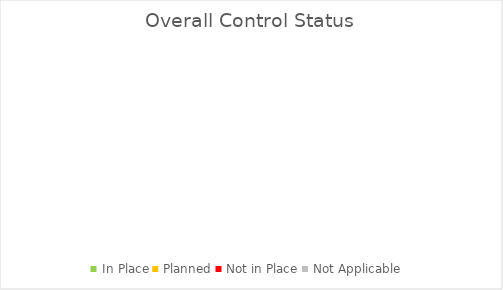
| Category | Series 0 |
|---|---|
| In Place | 0 |
| Planned | 0 |
| Not in Place | 0 |
| Not Applicable | 0 |